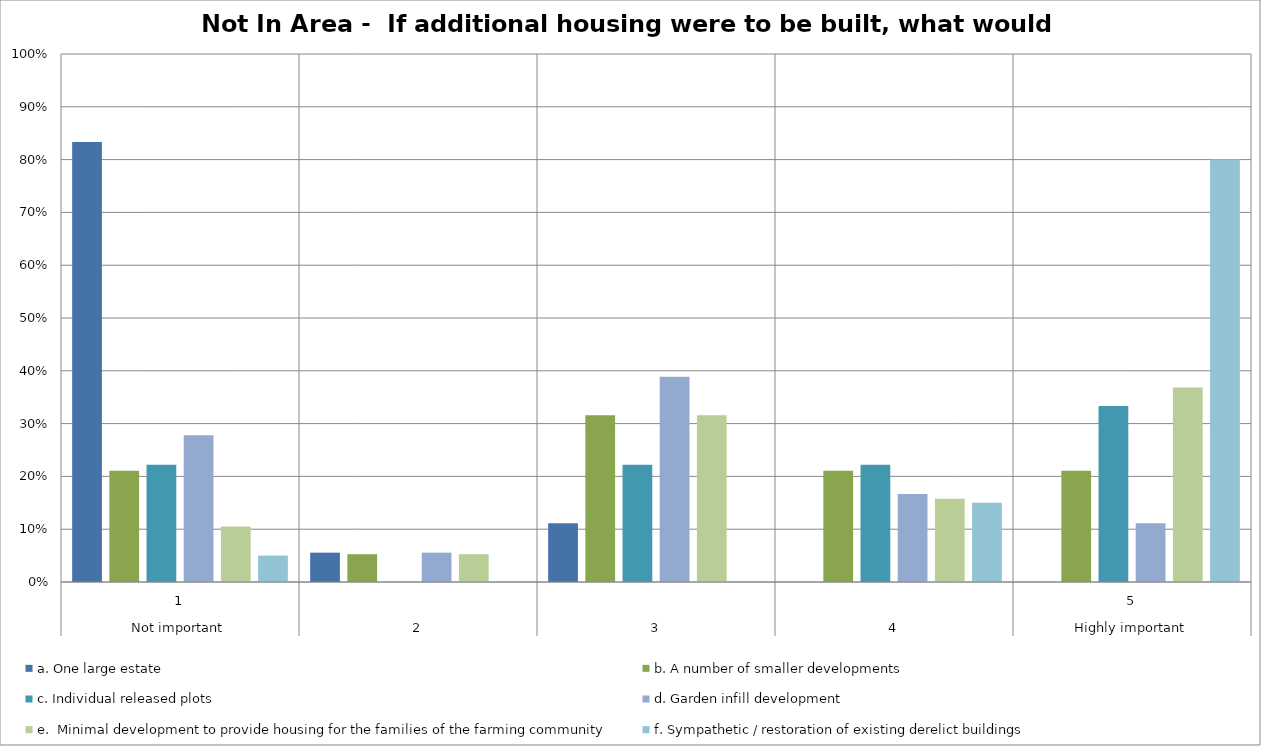
| Category | a. One large estate | b. A number of smaller developments | c. Individual released plots | d. Garden infill development | e.  Minimal development to provide housing for the families of the farming community | f. Sympathetic / restoration of existing derelict buildings |
|---|---|---|---|---|---|---|
| 0 | 0.833 | 0.211 | 0.222 | 0.278 | 0.105 | 0.05 |
| 1 | 0.056 | 0.053 | 0 | 0.056 | 0.053 | 0 |
| 2 | 0.111 | 0.316 | 0.222 | 0.389 | 0.316 | 0 |
| 3 | 0 | 0.211 | 0.222 | 0.167 | 0.158 | 0.15 |
| 4 | 0 | 0.211 | 0.333 | 0.111 | 0.368 | 0.8 |